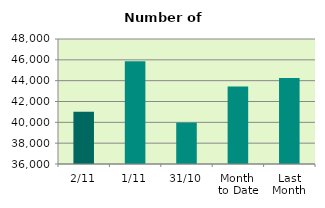
| Category | Series 0 |
|---|---|
| 2/11 | 41024 |
| 1/11 | 45876 |
| 31/10 | 39972 |
| Month 
to Date | 43450 |
| Last
Month | 44266.476 |